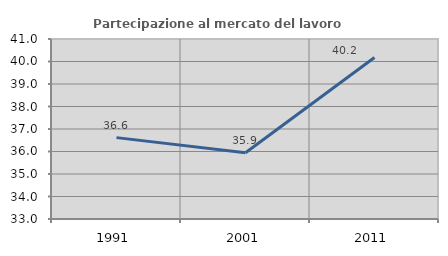
| Category | Partecipazione al mercato del lavoro  femminile |
|---|---|
| 1991.0 | 36.616 |
| 2001.0 | 35.946 |
| 2011.0 | 40.175 |